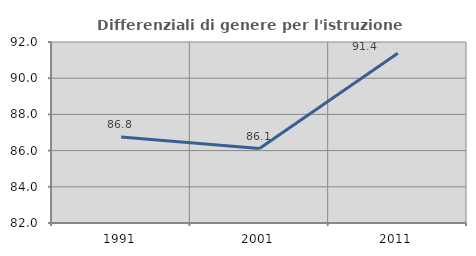
| Category | Differenziali di genere per l'istruzione superiore |
|---|---|
| 1991.0 | 86.754 |
| 2001.0 | 86.11 |
| 2011.0 | 91.384 |